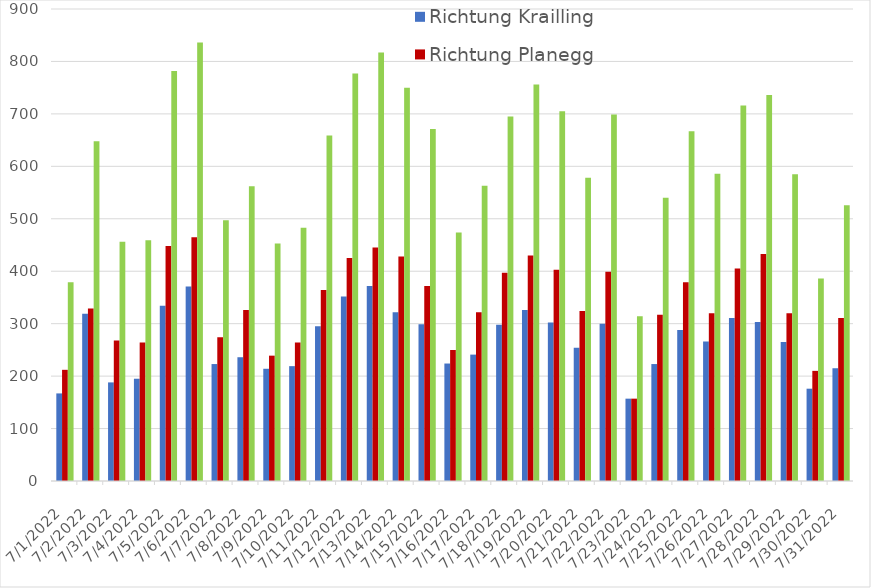
| Category | Richtung Krailling | Richtung Planegg | Gesamt |
|---|---|---|---|
| 7/1/22 | 167 | 212 | 379 |
| 7/2/22 | 319 | 329 | 648 |
| 7/3/22 | 188 | 268 | 456 |
| 7/4/22 | 195 | 264 | 459 |
| 7/5/22 | 334 | 448 | 782 |
| 7/6/22 | 371 | 465 | 836 |
| 7/7/22 | 223 | 274 | 497 |
| 7/8/22 | 236 | 326 | 562 |
| 7/9/22 | 214 | 239 | 453 |
| 7/10/22 | 219 | 264 | 483 |
| 7/11/22 | 295 | 364 | 659 |
| 7/12/22 | 352 | 425 | 777 |
| 7/13/22 | 372 | 445 | 817 |
| 7/14/22 | 322 | 428 | 750 |
| 7/15/22 | 299 | 372 | 671 |
| 7/16/22 | 224 | 250 | 474 |
| 7/17/22 | 241 | 322 | 563 |
| 7/18/22 | 298 | 397 | 695 |
| 7/19/22 | 326 | 430 | 756 |
| 7/20/22 | 302 | 403 | 705 |
| 7/21/22 | 254 | 324 | 578 |
| 7/22/22 | 300 | 399 | 699 |
| 7/23/22 | 157 | 157 | 314 |
| 7/24/22 | 223 | 317 | 540 |
| 7/25/22 | 288 | 379 | 667 |
| 7/26/22 | 266 | 320 | 586 |
| 7/27/22 | 311 | 405 | 716 |
| 7/28/22 | 303 | 433 | 736 |
| 7/29/22 | 265 | 320 | 585 |
| 7/30/22 | 176 | 210 | 386 |
| 7/31/22 | 215 | 311 | 526 |